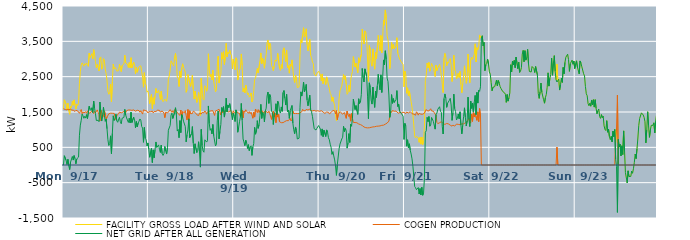
| Category | FACILITY GROSS LOAD AFTER WIND AND SOLAR | COGEN PRODUCTION | NET GRID AFTER ALL GENERATION |
|---|---|---|---|
|  Mon  9/17 | 1584 | 1590 | -6 |
|  Mon  9/17 | 1846 | 1583 | 263 |
|  Mon  9/17 | 1824 | 1571 | 253 |
|  Mon  9/17 | 1720 | 1591 | 129 |
|  Mon  9/17 | 1572 | 1558 | 14 |
|  Mon  9/17 | 1748 | 1588 | 160 |
|  Mon  9/17 | 1533 | 1555 | -22 |
|  Mon  9/17 | 1434 | 1563 | -129 |
|  Mon  9/17 | 1666 | 1585 | 81 |
|  Mon  9/17 | 1621 | 1554 | 67 |
|  Mon  9/17 | 1800 | 1558 | 242 |
|  Mon  9/17 | 1691 | 1552 | 139 |
|  Mon  9/17 | 1843 | 1577 | 266 |
|  Mon  9/17 | 1696 | 1517 | 179 |
|  Mon  9/17 | 1582 | 1548 | 34 |
|  Mon  9/17 | 1723 | 1549 | 174 |
|  Mon  9/17 | 1683 | 1531 | 152 |
|  Mon  9/17 | 1759 | 1536 | 223 |
|  Mon  9/17 | 2307 | 1464 | 843 |
|  Mon  9/17 | 2642 | 1513 | 1129 |
|  Mon  9/17 | 2835 | 1571 | 1264 |
|  Mon  9/17 | 2892 | 1450 | 1442 |
|  Mon  9/17 | 2895 | 1504 | 1391 |
|  Mon  9/17 | 2796 | 1474 | 1322 |
|  Mon  9/17 | 2869 | 1489 | 1380 |
|  Mon  9/17 | 2834 | 1507 | 1327 |
|  Mon  9/17 | 2889 | 1464 | 1425 |
|  Mon  9/17 | 2848 | 1533 | 1315 |
|  Mon  9/17 | 2793 | 1481 | 1312 |
|  Mon  9/17 | 3164 | 1503 | 1661 |
|  Mon  9/17 | 3042 | 1467 | 1575 |
|  Mon  9/17 | 3025 | 1482 | 1543 |
|  Mon  9/17 | 3152 | 1532 | 1620 |
|  Mon  9/17 | 3003 | 1516 | 1487 |
|  Mon  9/17 | 3264 | 1455 | 1809 |
|  Mon  9/17 | 3126 | 1522 | 1604 |
|  Mon  9/17 | 2926 | 1474 | 1452 |
|  Mon  9/17 | 2748 | 1489 | 1259 |
|  Mon  9/17 | 2846 | 1560 | 1286 |
|  Mon  9/17 | 2760 | 1494 | 1266 |
|  Mon  9/17 | 2660 | 1434 | 1226 |
|  Mon  9/17 | 3030 | 1247 | 1783 |
|  Mon  9/17 | 3060 | 1554 | 1506 |
|  Mon  9/17 | 2712 | 1468 | 1244 |
|  Mon  9/17 | 2768 | 1343 | 1425 |
|  Mon  9/17 | 3008 | 1375 | 1633 |
|  Mon  9/17 | 2947 | 1534 | 1413 |
|  Mon  9/17 | 2716 | 1478 | 1238 |
|  Mon  9/17 | 2586 | 1284 | 1302 |
|  Mon  9/17 | 2383 | 1357 | 1026 |
|  Mon  9/17 | 2089 | 1374 | 715 |
|  Mon  9/17 | 2001 | 1450 | 551 |
|  Mon  9/17 | 2037 | 1432 | 605 |
|  Mon  9/17 | 2291 | 1466 | 825 |
|  Mon  9/17 | 1788 | 1467 | 321 |
|  Mon  9/17 | 2361 | 1463 | 898 |
|  Mon  9/17 | 2856 | 1464 | 1392 |
|  Mon  9/17 | 2719 | 1460 | 1259 |
|  Mon  9/17 | 2757 | 1448 | 1309 |
|  Mon  9/17 | 2724 | 1288 | 1436 |
|  Mon  9/17 | 2657 | 1405 | 1252 |
|  Mon  9/17 | 2629 | 1420 | 1209 |
|  Mon  9/17 | 2669 | 1445 | 1224 |
|  Mon  9/17 | 2849 | 1497 | 1352 |
|  Mon  9/17 | 2740 | 1512 | 1228 |
|  Mon  9/17 | 2642 | 1476 | 1166 |
|  Mon  9/17 | 2819 | 1494 | 1325 |
|  Mon  9/17 | 2806 | 1500 | 1306 |
|  Mon  9/17 | 2859 | 1514 | 1345 |
|  Mon  9/17 | 3109 | 1536 | 1573 |
|  Mon  9/17 | 2893 | 1480 | 1413 |
|  Mon  9/17 | 2872 | 1539 | 1333 |
|  Mon  9/17 | 2854 | 1520 | 1334 |
|  Mon  9/17 | 2762 | 1557 | 1205 |
|  Mon  9/17 | 2898 | 1575 | 1323 |
|  Mon  9/17 | 2750 | 1557 | 1193 |
|  Mon  9/17 | 3037 | 1542 | 1495 |
|  Mon  9/17 | 2749 | 1547 | 1202 |
|  Mon  9/17 | 2740 | 1554 | 1186 |
|  Mon  9/17 | 2914 | 1560 | 1354 |
|  Mon  9/17 | 2835 | 1558 | 1277 |
|  Mon  9/17 | 2577 | 1523 | 1054 |
|  Mon  9/17 | 2768 | 1537 | 1231 |
|  Mon  9/17 | 2625 | 1549 | 1076 |
|  Mon  9/17 | 2709 | 1522 | 1187 |
|  Mon  9/17 | 2779 | 1539 | 1240 |
|  Mon  9/17 | 2796 | 1493 | 1303 |
|  Mon  9/17 | 2807 | 1537 | 1270 |
|  Mon  9/17 | 2647 | 1557 | 1090 |
|  Mon  9/17 | 2486 | 1441 | 1045 |
|  Mon  9/17 | 2202 | 1560 | 642 |
|  Mon  9/17 | 2613 | 1550 | 1063 |
|  Mon  9/17 | 2299 | 1543 | 756 |
|  Mon  9/17 | 2262 | 1551 | 711 |
|  Mon  9/17 | 2064 | 1522 | 542 |
|  Mon  9/17 | 2097 | 1473 | 624 |
|  Tue  9/18 | 1952 | 1506 | 446 |
|  Tue  9/18 | 1737 | 1518 | 219 |
|  Tue  9/18 | 1744 | 1509 | 235 |
|  Tue  9/18 | 2003 | 1534 | 469 |
|  Tue  9/18 | 1593 | 1524 | 69 |
|  Tue  9/18 | 1904 | 1476 | 428 |
|  Tue  9/18 | 1720 | 1515 | 205 |
|  Tue  9/18 | 1974 | 1538 | 436 |
|  Tue  9/18 | 2166 | 1514 | 652 |
|  Tue  9/18 | 2037 | 1541 | 496 |
|  Tue  9/18 | 2057 | 1553 | 504 |
|  Tue  9/18 | 2110 | 1541 | 569 |
|  Tue  9/18 | 1989 | 1545 | 444 |
|  Tue  9/18 | 1853 | 1497 | 356 |
|  Tue  9/18 | 2087 | 1525 | 562 |
|  Tue  9/18 | 1853 | 1530 | 323 |
|  Tue  9/18 | 1791 | 1520 | 271 |
|  Tue  9/18 | 1793 | 1473 | 320 |
|  Tue  9/18 | 1864 | 1340 | 524 |
|  Tue  9/18 | 1890 | 1490 | 400 |
|  Tue  9/18 | 1802 | 1492 | 310 |
|  Tue  9/18 | 1960 | 1471 | 489 |
|  Tue  9/18 | 2438 | 1454 | 984 |
|  Tue  9/18 | 2518 | 1529 | 989 |
|  Tue  9/18 | 2687 | 1567 | 1120 |
|  Tue  9/18 | 2950 | 1539 | 1411 |
|  Tue  9/18 | 2957 | 1489 | 1468 |
|  Tue  9/18 | 2854 | 1538 | 1316 |
|  Tue  9/18 | 2800 | 1483 | 1317 |
|  Tue  9/18 | 3057 | 1566 | 1491 |
|  Tue  9/18 | 3160 | 1539 | 1621 |
|  Tue  9/18 | 2946 | 1524 | 1422 |
|  Tue  9/18 | 2489 | 1528 | 961 |
|  Tue  9/18 | 2456 | 1451 | 1005 |
|  Tue  9/18 | 2222 | 1450 | 772 |
|  Tue  9/18 | 2661 | 1405 | 1256 |
|  Tue  9/18 | 2472 | 1556 | 916 |
|  Tue  9/18 | 2751 | 1324 | 1427 |
|  Tue  9/18 | 2865 | 1513 | 1352 |
|  Tue  9/18 | 2760 | 1520 | 1240 |
|  Tue  9/18 | 2695 | 1477 | 1218 |
|  Tue  9/18 | 2630 | 1541 | 1089 |
|  Tue  9/18 | 2058 | 1402 | 656 |
|  Tue  9/18 | 2136 | 1276 | 860 |
|  Tue  9/18 | 2560 | 1568 | 992 |
|  Tue  9/18 | 2565 | 1258 | 1307 |
|  Tue  9/18 | 2310 | 1535 | 775 |
|  Tue  9/18 | 2222 | 1452 | 770 |
|  Tue  9/18 | 2365 | 1477 | 888 |
|  Tue  9/18 | 2544 | 1457 | 1087 |
|  Tue  9/18 | 2144 | 1524 | 620 |
|  Tue  9/18 | 1867 | 1542 | 325 |
|  Tue  9/18 | 2090 | 1490 | 600 |
|  Tue  9/18 | 2063 | 1464 | 599 |
|  Tue  9/18 | 1773 | 1422 | 351 |
|  Tue  9/18 | 1857 | 1441 | 416 |
|  Tue  9/18 | 2057 | 1399 | 658 |
|  Tue  9/18 | 1839 | 1466 | 373 |
|  Tue  9/18 | 1397 | 1457 | -60 |
|  Tue  9/18 | 2453 | 1444 | 1009 |
|  Tue  9/18 | 2039 | 1489 | 550 |
|  Tue  9/18 | 1866 | 1468 | 398 |
|  Tue  9/18 | 1837 | 1476 | 361 |
|  Tue  9/18 | 2243 | 1530 | 713 |
|  Tue  9/18 | 2205 | 1500 | 705 |
|  Tue  9/18 | 2088 | 1439 | 649 |
|  Tue  9/18 | 2190 | 1504 | 686 |
|  Tue  9/18 | 3148 | 1477 | 1671 |
|  Tue  9/18 | 2689 | 1518 | 1171 |
|  Tue  9/18 | 2498 | 1516 | 982 |
|  Tue  9/18 | 2563 | 1531 | 1032 |
|  Tue  9/18 | 2408 | 1528 | 880 |
|  Tue  9/18 | 2683 | 1537 | 1146 |
|  Tue  9/18 | 2357 | 1530 | 827 |
|  Tue  9/18 | 2204 | 1401 | 803 |
|  Tue  9/18 | 2071 | 1531 | 540 |
|  Tue  9/18 | 2126 | 1544 | 582 |
|  Tue  9/18 | 2797 | 1549 | 1248 |
|  Tue  9/18 | 3080 | 1552 | 1528 |
|  Tue  9/18 | 2321 | 1580 | 741 |
|  Tue  9/18 | 2513 | 1561 | 952 |
|  Tue  9/18 | 2562 | 1415 | 1147 |
|  Tue  9/18 | 3181 | 1554 | 1627 |
|  Tue  9/18 | 2998 | 1478 | 1520 |
|  Tue  9/18 | 3207 | 1556 | 1651 |
|  Tue  9/18 | 2846 | 1490 | 1356 |
|  Tue  9/18 | 3059 | 1507 | 1552 |
|  Tue  9/18 | 3443 | 1551 | 1892 |
|  Tue  9/18 | 3062 | 1563 | 1499 |
|  Tue  9/18 | 3199 | 1500 | 1699 |
|  Tue  9/18 | 3149 | 1526 | 1623 |
|  Tue  9/18 | 3249 | 1511 | 1738 |
|  Tue  9/18 | 3142 | 1555 | 1587 |
|  Tue  9/18 | 3105 | 1544 | 1561 |
|  Tue  9/18 | 2719 | 1434 | 1285 |
|  Tue  9/18 | 2998 | 1534 | 1464 |
|  Wed  9/19 | 2869 | 1478 | 1391 |
|  Wed  9/19 | 2697 | 1466 | 1231 |
|  Wed  9/19 | 3034 | 1474 | 1560 |
|  Wed  9/19 | 2979 | 1514 | 1465 |
|  Wed  9/19 | 2404 | 1477 | 927 |
|  Wed  9/19 | 2530 | 1466 | 1064 |
|  Wed  9/19 | 2683 | 1458 | 1225 |
|  Wed  9/19 | 2724 | 1362 | 1362 |
|  Wed  9/19 | 3143 | 1401 | 1742 |
|  Wed  9/19 | 2818 | 1550 | 1268 |
|  Wed  9/19 | 2072 | 1335 | 737 |
|  Wed  9/19 | 2178 | 1527 | 651 |
|  Wed  9/19 | 2041 | 1492 | 549 |
|  Wed  9/19 | 2264 | 1563 | 701 |
|  Wed  9/19 | 2150 | 1522 | 628 |
|  Wed  9/19 | 1990 | 1522 | 468 |
|  Wed  9/19 | 2039 | 1463 | 576 |
|  Wed  9/19 | 1919 | 1511 | 408 |
|  Wed  9/19 | 1955 | 1454 | 501 |
|  Wed  9/19 | 2040 | 1496 | 544 |
|  Wed  9/19 | 1782 | 1510 | 272 |
|  Wed  9/19 | 1836 | 1324 | 512 |
|  Wed  9/19 | 2104 | 1497 | 607 |
|  Wed  9/19 | 2420 | 1356 | 1064 |
|  Wed  9/19 | 2455 | 1585 | 870 |
|  Wed  9/19 | 2473 | 1543 | 930 |
|  Wed  9/19 | 2734 | 1479 | 1255 |
|  Wed  9/19 | 2607 | 1569 | 1038 |
|  Wed  9/19 | 2620 | 1480 | 1140 |
|  Wed  9/19 | 2935 | 1544 | 1391 |
|  Wed  9/19 | 3172 | 1456 | 1716 |
|  Wed  9/19 | 2866 | 1547 | 1319 |
|  Wed  9/19 | 3020 | 1531 | 1489 |
|  Wed  9/19 | 2917 | 1475 | 1442 |
|  Wed  9/19 | 2739 | 1518 | 1221 |
|  Wed  9/19 | 2980 | 1453 | 1527 |
|  Wed  9/19 | 3126 | 1518 | 1608 |
|  Wed  9/19 | 3456 | 1502 | 1954 |
|  Wed  9/19 | 3539 | 1475 | 2064 |
|  Wed  9/19 | 3269 | 1525 | 1744 |
|  Wed  9/19 | 3452 | 1457 | 1995 |
|  Wed  9/19 | 3394 | 1478 | 1916 |
|  Wed  9/19 | 2812 | 1290 | 1522 |
|  Wed  9/19 | 2769 | 1277 | 1492 |
|  Wed  9/19 | 2671 | 1524 | 1147 |
|  Wed  9/19 | 2799 | 1361 | 1438 |
|  Wed  9/19 | 2974 | 1465 | 1509 |
|  Wed  9/19 | 2934 | 1200 | 1734 |
|  Wed  9/19 | 2971 | 1546 | 1425 |
|  Wed  9/19 | 3160 | 1356 | 1804 |
|  Wed  9/19 | 3178 | 1441 | 1737 |
|  Wed  9/19 | 2736 | 1222 | 1514 |
|  Wed  9/19 | 2675 | 1205 | 1470 |
|  Wed  9/19 | 2841 | 1198 | 1643 |
|  Wed  9/19 | 2732 | 1214 | 1518 |
|  Wed  9/19 | 3247 | 1199 | 2048 |
|  Wed  9/19 | 3317 | 1209 | 2108 |
|  Wed  9/19 | 3114 | 1231 | 1883 |
|  Wed  9/19 | 2926 | 1229 | 1697 |
|  Wed  9/19 | 3254 | 1256 | 1998 |
|  Wed  9/19 | 2755 | 1248 | 1507 |
|  Wed  9/19 | 2812 | 1255 | 1557 |
|  Wed  9/19 | 2598 | 1278 | 1320 |
|  Wed  9/19 | 2856 | 1319 | 1537 |
|  Wed  9/19 | 2794 | 1245 | 1549 |
|  Wed  9/19 | 2975 | 1291 | 1684 |
|  Wed  9/19 | 2712 | 1526 | 1186 |
|  Wed  9/19 | 2453 | 1457 | 996 |
|  Wed  9/19 | 2334 | 1448 | 886 |
|  Wed  9/19 | 2535 | 1459 | 1076 |
|  Wed  9/19 | 2454 | 1482 | 972 |
|  Wed  9/19 | 2192 | 1456 | 736 |
|  Wed  9/19 | 2185 | 1462 | 723 |
|  Wed  9/19 | 2213 | 1453 | 760 |
|  Wed  9/19 | 3110 | 1482 | 1628 |
|  Wed  9/19 | 3543 | 1473 | 2070 |
|  Wed  9/19 | 3456 | 1505 | 1951 |
|  Wed  9/19 | 3689 | 1577 | 2112 |
|  Wed  9/19 | 3886 | 1537 | 2349 |
|  Wed  9/19 | 3617 | 1551 | 2066 |
|  Wed  9/19 | 3690 | 1535 | 2155 |
|  Wed  9/19 | 3855 | 1574 | 2281 |
|  Wed  9/19 | 3409 | 1572 | 1837 |
|  Wed  9/19 | 3231 | 1555 | 1676 |
|  Wed  9/19 | 3256 | 1559 | 1697 |
|  Wed  9/19 | 3556 | 1584 | 1972 |
|  Wed  9/19 | 3105 | 1544 | 1561 |
|  Wed  9/19 | 3037 | 1532 | 1505 |
|  Wed  9/19 | 2910 | 1532 | 1378 |
|  Wed  9/19 | 2871 | 1521 | 1350 |
|  Wed  9/19 | 2571 | 1546 | 1025 |
|  Wed  9/19 | 2574 | 1532 | 1042 |
|  Wed  9/19 | 2515 | 1524 | 991 |
|  Wed  9/19 | 2582 | 1544 | 1038 |
|  Wed  9/19 | 2573 | 1538 | 1035 |
|  Wed  9/19 | 2655 | 1538 | 1117 |
|  Thu  9/20 | 2639 | 1518 | 1121 |
|  Thu  9/20 | 2547 | 1532 | 1015 |
|  Thu  9/20 | 2379 | 1538 | 841 |
|  Thu  9/20 | 2577 | 1556 | 1021 |
|  Thu  9/20 | 2301 | 1498 | 803 |
|  Thu  9/20 | 2464 | 1480 | 984 |
|  Thu  9/20 | 2419 | 1458 | 961 |
|  Thu  9/20 | 2274 | 1466 | 808 |
|  Thu  9/20 | 2493 | 1500 | 993 |
|  Thu  9/20 | 2399 | 1472 | 927 |
|  Thu  9/20 | 2262 | 1490 | 772 |
|  Thu  9/20 | 2162 | 1447 | 715 |
|  Thu  9/20 | 2027 | 1439 | 588 |
|  Thu  9/20 | 1985 | 1485 | 500 |
|  Thu  9/20 | 1802 | 1500 | 302 |
|  Thu  9/20 | 1923 | 1546 | 377 |
|  Thu  9/20 | 1775 | 1519 | 256 |
|  Thu  9/20 | 1675 | 1531 | 144 |
|  Thu  9/20 | 1418 | 1445 | -27 |
|  Thu  9/20 | 1248 | 1542 | -294 |
|  Thu  9/20 | 1296 | 1285 | 11 |
|  Thu  9/20 | 1447 | 1430 | 17 |
|  Thu  9/20 | 1890 | 1430 | 460 |
|  Thu  9/20 | 2103 | 1511 | 592 |
|  Thu  9/20 | 2095 | 1482 | 613 |
|  Thu  9/20 | 2230 | 1494 | 736 |
|  Thu  9/20 | 2225 | 1440 | 785 |
|  Thu  9/20 | 2561 | 1468 | 1093 |
|  Thu  9/20 | 2427 | 1483 | 944 |
|  Thu  9/20 | 2524 | 1489 | 1035 |
|  Thu  9/20 | 2298 | 1321 | 977 |
|  Thu  9/20 | 2001 | 1524 | 477 |
|  Thu  9/20 | 2047 | 1425 | 622 |
|  Thu  9/20 | 2257 | 1369 | 888 |
|  Thu  9/20 | 2081 | 1442 | 639 |
|  Thu  9/20 | 2395 | 1241 | 1154 |
|  Thu  9/20 | 2554 | 1457 | 1097 |
|  Thu  9/20 | 2647 | 1322 | 1325 |
|  Thu  9/20 | 3066 | 1205 | 1861 |
|  Thu  9/20 | 3093 | 1204 | 1889 |
|  Thu  9/20 | 2773 | 1202 | 1571 |
|  Thu  9/20 | 2882 | 1200 | 1682 |
|  Thu  9/20 | 2728 | 1196 | 1532 |
|  Thu  9/20 | 2610 | 1178 | 1432 |
|  Thu  9/20 | 3035 | 1161 | 1874 |
|  Thu  9/20 | 2902 | 1163 | 1739 |
|  Thu  9/20 | 2922 | 1144 | 1778 |
|  Thu  9/20 | 3136 | 1137 | 1999 |
|  Thu  9/20 | 3848 | 1117 | 2731 |
|  Thu  9/20 | 3578 | 1109 | 2469 |
|  Thu  9/20 | 3426 | 1076 | 2350 |
|  Thu  9/20 | 3796 | 1075 | 2721 |
|  Thu  9/20 | 3762 | 1057 | 2705 |
|  Thu  9/20 | 3574 | 1057 | 2517 |
|  Thu  9/20 | 3001 | 1051 | 1950 |
|  Thu  9/20 | 2369 | 1056 | 1313 |
|  Thu  9/20 | 3379 | 1054 | 2325 |
|  Thu  9/20 | 3259 | 1063 | 2196 |
|  Thu  9/20 | 2901 | 1066 | 1835 |
|  Thu  9/20 | 2797 | 1073 | 1724 |
|  Thu  9/20 | 3284 | 1078 | 2206 |
|  Thu  9/20 | 2934 | 1082 | 1852 |
|  Thu  9/20 | 2711 | 1082 | 1629 |
|  Thu  9/20 | 3190 | 1102 | 2088 |
|  Thu  9/20 | 3009 | 1096 | 1913 |
|  Thu  9/20 | 3333 | 1085 | 2248 |
|  Thu  9/20 | 3667 | 1100 | 2567 |
|  Thu  9/20 | 3406 | 1106 | 2300 |
|  Thu  9/20 | 3232 | 1106 | 2126 |
|  Thu  9/20 | 3664 | 1112 | 2552 |
|  Thu  9/20 | 3175 | 1122 | 2053 |
|  Thu  9/20 | 3623 | 1137 | 2486 |
|  Thu  9/20 | 4102 | 1128 | 2974 |
|  Thu  9/20 | 3958 | 1123 | 2835 |
|  Thu  9/20 | 4389 | 1156 | 3233 |
|  Thu  9/20 | 4168 | 1166 | 3002 |
|  Thu  9/20 | 3648 | 1187 | 2461 |
|  Thu  9/20 | 3558 | 1199 | 2359 |
|  Thu  9/20 | 3222 | 1242 | 1980 |
|  Thu  9/20 | 2727 | 1380 | 1347 |
|  Thu  9/20 | 3046 | 1530 | 1516 |
|  Thu  9/20 | 3478 | 1486 | 1992 |
|  Thu  9/20 | 3287 | 1542 | 1745 |
|  Thu  9/20 | 3411 | 1532 | 1879 |
|  Thu  9/20 | 3289 | 1521 | 1768 |
|  Thu  9/20 | 3322 | 1548 | 1774 |
|  Thu  9/20 | 3382 | 1527 | 1855 |
|  Thu  9/20 | 3603 | 1498 | 2105 |
|  Thu  9/20 | 3159 | 1503 | 1656 |
|  Thu  9/20 | 3183 | 1462 | 1721 |
|  Thu  9/20 | 3000 | 1477 | 1523 |
|  Thu  9/20 | 3023 | 1502 | 1521 |
|  Thu  9/20 | 2916 | 1458 | 1458 |
|  Thu  9/20 | 2925 | 1490 | 1435 |
|  Thu  9/20 | 2845 | 1463 | 1382 |
|  Thu  9/20 | 2213 | 1489 | 724 |
|  Fri  9/21 | 2656 | 1479 | 1177 |
|  Fri  9/21 | 2561 | 1457 | 1104 |
|  Fri  9/21 | 2030 | 1498 | 532 |
|  Fri  9/21 | 2185 | 1471 | 714 |
|  Fri  9/21 | 1955 | 1471 | 484 |
|  Fri  9/21 | 2098 | 1498 | 600 |
|  Fri  9/21 | 1927 | 1508 | 419 |
|  Fri  9/21 | 1792 | 1482 | 310 |
|  Fri  9/21 | 1627 | 1453 | 174 |
|  Fri  9/21 | 1427 | 1462 | -35 |
|  Fri  9/21 | 1410 | 1437 | -27 |
|  Fri  9/21 | 821 | 1430 | -609 |
|  Fri  9/21 | 765 | 1409 | -644 |
|  Fri  9/21 | 807 | 1506 | -699 |
|  Fri  9/21 | 788 | 1474 | -686 |
|  Fri  9/21 | 773 | 1411 | -638 |
|  Fri  9/21 | 642 | 1463 | -821 |
|  Fri  9/21 | 781 | 1448 | -667 |
|  Fri  9/21 | 590 | 1438 | -848 |
|  Fri  9/21 | 791 | 1422 | -631 |
|  Fri  9/21 | 580 | 1437 | -857 |
|  Fri  9/21 | 686 | 1462 | -776 |
|  Fri  9/21 | 1107 | 1468 | -361 |
|  Fri  9/21 | 2398 | 1471 | 927 |
|  Fri  9/21 | 2537 | 1570 | 967 |
|  Fri  9/21 | 2884 | 1536 | 1348 |
|  Fri  9/21 | 2747 | 1519 | 1228 |
|  Fri  9/21 | 2901 | 1530 | 1371 |
|  Fri  9/21 | 2654 | 1557 | 1097 |
|  Fri  9/21 | 2723 | 1592 | 1131 |
|  Fri  9/21 | 2877 | 1531 | 1346 |
|  Fri  9/21 | 2879 | 1557 | 1322 |
|  Fri  9/21 | 2756 | 1523 | 1233 |
|  Fri  9/21 | 2739 | 1481 | 1258 |
|  Fri  9/21 | 2505 | 1490 | 1015 |
|  Fri  9/21 | 2824 | 1401 | 1423 |
|  Fri  9/21 | 2674 | 1203 | 1471 |
|  Fri  9/21 | 2748 | 1171 | 1577 |
|  Fri  9/21 | 2745 | 1151 | 1594 |
|  Fri  9/21 | 2845 | 1196 | 1649 |
|  Fri  9/21 | 2722 | 1202 | 1520 |
|  Fri  9/21 | 2711 | 1225 | 1486 |
|  Fri  9/21 | 2304 | 1212 | 1092 |
|  Fri  9/21 | 2050 | 1173 | 877 |
|  Fri  9/21 | 3029 | 1147 | 1882 |
|  Fri  9/21 | 3159 | 1148 | 2011 |
|  Fri  9/21 | 3052 | 1162 | 1890 |
|  Fri  9/21 | 2808 | 1176 | 1632 |
|  Fri  9/21 | 2918 | 1170 | 1748 |
|  Fri  9/21 | 2882 | 1162 | 1720 |
|  Fri  9/21 | 2983 | 1151 | 1832 |
|  Fri  9/21 | 3014 | 1127 | 1887 |
|  Fri  9/21 | 2828 | 1130 | 1698 |
|  Fri  9/21 | 2362 | 1099 | 1263 |
|  Fri  9/21 | 2599 | 1129 | 1470 |
|  Fri  9/21 | 3110 | 1104 | 2006 |
|  Fri  9/21 | 2693 | 1100 | 1593 |
|  Fri  9/21 | 2638 | 1128 | 1510 |
|  Fri  9/21 | 2435 | 1159 | 1276 |
|  Fri  9/21 | 2461 | 1144 | 1317 |
|  Fri  9/21 | 2594 | 1149 | 1445 |
|  Fri  9/21 | 2479 | 1170 | 1309 |
|  Fri  9/21 | 2646 | 1140 | 1506 |
|  Fri  9/21 | 2279 | 1147 | 1132 |
|  Fri  9/21 | 2046 | 1165 | 881 |
|  Fri  9/21 | 2292 | 1170 | 1122 |
|  Fri  9/21 | 2531 | 1163 | 1368 |
|  Fri  9/21 | 2807 | 1189 | 1618 |
|  Fri  9/21 | 2541 | 1196 | 1345 |
|  Fri  9/21 | 2311 | 1208 | 1103 |
|  Fri  9/21 | 2473 | 1225 | 1248 |
|  Fri  9/21 | 3141 | 1220 | 1921 |
|  Fri  9/21 | 2615 | 1317 | 1298 |
|  Fri  9/21 | 2327 | 1239 | 1088 |
|  Fri  9/21 | 2993 | 1185 | 1808 |
|  Fri  9/21 | 3047 | 1444 | 1603 |
|  Fri  9/21 | 2984 | 1233 | 1751 |
|  Fri  9/21 | 2982 | 1484 | 1498 |
|  Fri  9/21 | 3132 | 1359 | 1773 |
|  Fri  9/21 | 3430 | 1461 | 1969 |
|  Fri  9/21 | 2916 | 1489 | 1427 |
|  Fri  9/21 | 3321 | 1265 | 2056 |
|  Fri  9/21 | 3258 | 1506 | 1752 |
|  Fri  9/21 | 3341 | 1227 | 2114 |
|  Fri  9/21 | 3681 | 1596 | 2085 |
|  Fri  9/21 | 3602 | 1389 | 2213 |
|  Fri  9/21 | 3594 | 0 | 3594 |
|  Fri  9/21 | 3658 | 0 | 3658 |
|  Fri  9/21 | 3371 | 0 | 3371 |
|  Fri  9/21 | 3470 | 0 | 3470 |
|  Fri  9/21 | 2670 | 0 | 2670 |
|  Fri  9/21 | 2836 | 0 | 2836 |
|  Fri  9/21 | 2874 | 0 | 2874 |
|  Fri  9/21 | 2996 | 0 | 2996 |
|  Fri  9/21 | 2859 | 0 | 2859 |
|  Fri  9/21 | 2636 | 0 | 2636 |
|  Sat  9/22 | 2571 | 0 | 2571 |
|  Sat  9/22 | 2336 | 0 | 2336 |
|  Sat  9/22 | 2101 | 0 | 2101 |
|  Sat  9/22 | 2198 | 0 | 2198 |
|  Sat  9/22 | 2178 | 0 | 2178 |
|  Sat  9/22 | 2218 | 0 | 2218 |
|  Sat  9/22 | 2233 | 0 | 2233 |
|  Sat  9/22 | 2403 | 0 | 2403 |
|  Sat  9/22 | 2236 | 0 | 2236 |
|  Sat  9/22 | 2392 | 0 | 2392 |
|  Sat  9/22 | 2321 | 0 | 2321 |
|  Sat  9/22 | 2224 | 0 | 2224 |
|  Sat  9/22 | 2169 | 0 | 2169 |
|  Sat  9/22 | 2142 | 0 | 2142 |
|  Sat  9/22 | 2080 | 0 | 2080 |
|  Sat  9/22 | 2088 | 0 | 2088 |
|  Sat  9/22 | 2044 | 0 | 2044 |
|  Sat  9/22 | 2003 | 0 | 2003 |
|  Sat  9/22 | 1773 | 0 | 1773 |
|  Sat  9/22 | 1995 | 0 | 1995 |
|  Sat  9/22 | 1807 | 0 | 1807 |
|  Sat  9/22 | 1903 | 0 | 1903 |
|  Sat  9/22 | 2041 | 0 | 2041 |
|  Sat  9/22 | 2838 | 0 | 2838 |
|  Sat  9/22 | 2633 | 0 | 2633 |
|  Sat  9/22 | 2941 | 0 | 2941 |
|  Sat  9/22 | 2836 | 0 | 2836 |
|  Sat  9/22 | 2960 | 0 | 2960 |
|  Sat  9/22 | 2754 | 0 | 2754 |
|  Sat  9/22 | 3054 | 0 | 3054 |
|  Sat  9/22 | 3057 | 0 | 3057 |
|  Sat  9/22 | 2729 | 0 | 2729 |
|  Sat  9/22 | 2909 | 0 | 2909 |
|  Sat  9/22 | 2620 | 0 | 2620 |
|  Sat  9/22 | 2657 | 0 | 2657 |
|  Sat  9/22 | 2755 | 0 | 2755 |
|  Sat  9/22 | 3141 | 0 | 3141 |
|  Sat  9/22 | 3243 | 0 | 3243 |
|  Sat  9/22 | 2924 | 0 | 2924 |
|  Sat  9/22 | 3236 | 0 | 3236 |
|  Sat  9/22 | 2968 | 0 | 2968 |
|  Sat  9/22 | 3045 | 0 | 3045 |
|  Sat  9/22 | 3272 | 0 | 3272 |
|  Sat  9/22 | 2862 | 0 | 2862 |
|  Sat  9/22 | 2647 | 0 | 2647 |
|  Sat  9/22 | 2625 | 0 | 2625 |
|  Sat  9/22 | 2633 | 0 | 2633 |
|  Sat  9/22 | 2787 | 0 | 2787 |
|  Sat  9/22 | 2791 | 0 | 2791 |
|  Sat  9/22 | 2735 | 0 | 2735 |
|  Sat  9/22 | 2618 | 0 | 2618 |
|  Sat  9/22 | 2786 | 0 | 2786 |
|  Sat  9/22 | 2809 | 0 | 2809 |
|  Sat  9/22 | 2550 | 0 | 2550 |
|  Sat  9/22 | 2021 | 0 | 2021 |
|  Sat  9/22 | 1886 | 0 | 1886 |
|  Sat  9/22 | 2072 | 0 | 2072 |
|  Sat  9/22 | 2320 | 0 | 2320 |
|  Sat  9/22 | 2058 | 0 | 2058 |
|  Sat  9/22 | 2074 | 0 | 2074 |
|  Sat  9/22 | 1846 | 0 | 1846 |
|  Sat  9/22 | 1749 | 0 | 1749 |
|  Sat  9/22 | 1909 | 0 | 1909 |
|  Sat  9/22 | 1996 | 0 | 1996 |
|  Sat  9/22 | 2200 | 0 | 2200 |
|  Sat  9/22 | 2609 | 0 | 2609 |
|  Sat  9/22 | 2233 | 0 | 2233 |
|  Sat  9/22 | 2457 | 0 | 2457 |
|  Sat  9/22 | 2564 | 0 | 2564 |
|  Sat  9/22 | 3023 | 0 | 3023 |
|  Sat  9/22 | 2541 | 0 | 2541 |
|  Sat  9/22 | 2882 | 0 | 2882 |
|  Sat  9/22 | 3095 | 0 | 3095 |
|  Sat  9/22 | 2650 | 0 | 2650 |
|  Sat  9/22 | 2412 | 0 | 2412 |
|  Sat  9/22 | 2855 | 506 | 2349 |
|  Sat  9/22 | 2365 | 0 | 2365 |
|  Sat  9/22 | 2428 | 0 | 2428 |
|  Sat  9/22 | 2121 | 0 | 2121 |
|  Sat  9/22 | 2276 | 0 | 2276 |
|  Sat  9/22 | 2455 | 0 | 2455 |
|  Sat  9/22 | 2338 | 0 | 2338 |
|  Sat  9/22 | 2762 | 0 | 2762 |
|  Sat  9/22 | 2581 | 0 | 2581 |
|  Sat  9/22 | 2905 | 0 | 2905 |
|  Sat  9/22 | 3050 | 0 | 3050 |
|  Sat  9/22 | 3053 | 0 | 3053 |
|  Sat  9/22 | 3136 | 0 | 3136 |
|  Sat  9/22 | 2982 | 0 | 2982 |
|  Sat  9/22 | 2651 | 0 | 2651 |
|  Sat  9/22 | 2868 | 0 | 2868 |
|  Sat  9/22 | 2895 | 0 | 2895 |
|  Sat  9/22 | 2968 | 0 | 2968 |
|  Sat  9/22 | 2852 | 0 | 2852 |
|  Sat  9/22 | 2939 | 0 | 2939 |
|  Sat  9/22 | 2730 | 0 | 2730 |
|  Sun  9/23 | 2725 | 0 | 2725 |
|  Sun  9/23 | 2947 | 0 | 2947 |
|  Sun  9/23 | 2774 | 0 | 2774 |
|  Sun  9/23 | 2762 | 0 | 2762 |
|  Sun  9/23 | 2579 | 0 | 2579 |
|  Sun  9/23 | 2945 | 0 | 2945 |
|  Sun  9/23 | 2882 | 0 | 2882 |
|  Sun  9/23 | 2776 | 0 | 2776 |
|  Sun  9/23 | 2751 | 0 | 2751 |
|  Sun  9/23 | 2582 | 0 | 2582 |
|  Sun  9/23 | 2520 | 0 | 2520 |
|  Sun  9/23 | 2225 | 0 | 2225 |
|  Sun  9/23 | 2016 | 0 | 2016 |
|  Sun  9/23 | 1959 | 0 | 1959 |
|  Sun  9/23 | 1736 | 0 | 1736 |
|  Sun  9/23 | 1676 | 0 | 1676 |
|  Sun  9/23 | 1752 | 0 | 1752 |
|  Sun  9/23 | 1664 | 0 | 1664 |
|  Sun  9/23 | 1840 | 0 | 1840 |
|  Sun  9/23 | 1702 | 0 | 1702 |
|  Sun  9/23 | 1848 | 0 | 1848 |
|  Sun  9/23 | 1639 | 0 | 1639 |
|  Sun  9/23 | 1848 | 0 | 1848 |
|  Sun  9/23 | 1607 | 0 | 1607 |
|  Sun  9/23 | 1449 | 0 | 1449 |
|  Sun  9/23 | 1535 | 0 | 1535 |
|  Sun  9/23 | 1585 | 0 | 1585 |
|  Sun  9/23 | 1371 | 0 | 1371 |
|  Sun  9/23 | 1319 | 0 | 1319 |
|  Sun  9/23 | 1426 | 0 | 1426 |
|  Sun  9/23 | 1339 | 0 | 1339 |
|  Sun  9/23 | 1386 | 0 | 1386 |
|  Sun  9/23 | 1108 | 0 | 1108 |
|  Sun  9/23 | 1007 | 0 | 1007 |
|  Sun  9/23 | 975 | 0 | 975 |
|  Sun  9/23 | 1255 | 0 | 1255 |
|  Sun  9/23 | 928 | 0 | 928 |
|  Sun  9/23 | 1014 | 0 | 1014 |
|  Sun  9/23 | 802 | 0 | 802 |
|  Sun  9/23 | 716 | 0 | 716 |
|  Sun  9/23 | 812 | 0 | 812 |
|  Sun  9/23 | 655 | 0 | 655 |
|  Sun  9/23 | 960 | 0 | 960 |
|  Sun  9/23 | 801 | 0 | 801 |
|  Sun  9/23 | 1005 | 0 | 1005 |
|  Sun  9/23 | 872 | 706 | 166 |
|  Sun  9/23 | 980 | 1018 | -38 |
|  Sun  9/23 | 637 | 1978 | -1341 |
|  Sun  9/23 | 723 | 0 | 723 |
|  Sun  9/23 | 509 | 0 | 509 |
|  Sun  9/23 | 588 | 0 | 588 |
|  Sun  9/23 | 259 | 0 | 259 |
|  Sun  9/23 | 544 | 0 | 544 |
|  Sun  9/23 | 296 | 0 | 296 |
|  Sun  9/23 | 965 | 0 | 965 |
|  Sun  9/23 | 400 | 0 | 400 |
|  Sun  9/23 | -215 | 0 | -215 |
|  Sun  9/23 | -239 | 0 | -239 |
|  Sun  9/23 | -505 | 0 | -505 |
|  Sun  9/23 | -165 | 0 | -165 |
|  Sun  9/23 | -326 | 0 | -326 |
|  Sun  9/23 | -321 | 0 | -321 |
|  Sun  9/23 | -324 | 0 | -324 |
|  Sun  9/23 | -172 | 0 | -172 |
|  Sun  9/23 | -235 | 0 | -235 |
|  Sun  9/23 | -107 | 0 | -107 |
|  Sun  9/23 | 70 | 0 | 70 |
|  Sun  9/23 | 308 | 0 | 308 |
|  Sun  9/23 | 181 | 0 | 181 |
|  Sun  9/23 | 454 | 0 | 454 |
|  Sun  9/23 | 764 | 0 | 764 |
|  Sun  9/23 | 1123 | 0 | 1123 |
|  Sun  9/23 | 1319 | 0 | 1319 |
|  Sun  9/23 | 1338 | 0 | 1338 |
|  Sun  9/23 | 1475 | 0 | 1475 |
|  Sun  9/23 | 1462 | 0 | 1462 |
|  Sun  9/23 | 1416 | 0 | 1416 |
|  Sun  9/23 | 1349 | 0 | 1349 |
|  Sun  9/23 | 1223 | 0 | 1223 |
|  Sun  9/23 | 626 | 0 | 626 |
|  Sun  9/23 | 999 | 0 | 999 |
|  Sun  9/23 | 1506 | 0 | 1506 |
|  Sun  9/23 | 1114 | 0 | 1114 |
|  Sun  9/23 | 783 | 0 | 783 |
|  Sun  9/23 | 986 | 0 | 986 |
|  Sun  9/23 | 1120 | 0 | 1120 |
|  Sun  9/23 | 1108 | 0 | 1108 |
|  Sun  9/23 | 1125 | 0 | 1125 |
|  Sun  9/23 | 1194 | 0 | 1194 |
|  Sun  9/23 | 910 | 0 | 910 |
|  Sun  9/23 | 1239 | 0 | 1239 |
|  Sun  9/23 | 1421 | 0 | 1421 |